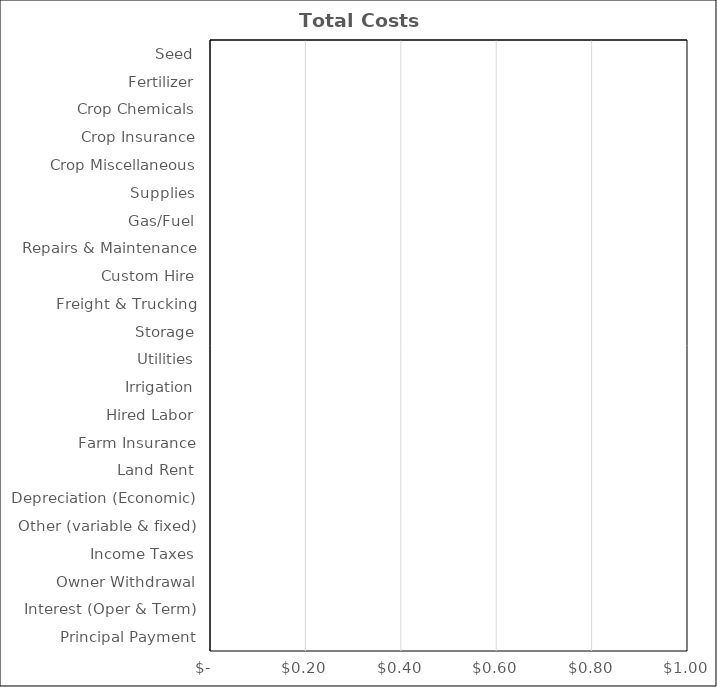
| Category | Alfalfa Hay Seeding |
|---|---|
| Seed | 0 |
| Fertilizer | 0 |
| Crop Chemicals | 0 |
| Crop Insurance | 0 |
| Crop Miscellaneous | 0 |
| Supplies | 0 |
| Gas/Fuel | 0 |
| Repairs & Maintenance | 0 |
| Custom Hire | 0 |
| Freight & Trucking | 0 |
| Storage | 0 |
| Utilities | 0 |
| Irrigation | 0 |
| Hired Labor | 0 |
| Farm Insurance | 0 |
| Land Rent | 0 |
| Depreciation (Economic) | 0 |
| Other (variable & fixed) | 0 |
| Income Taxes | 0 |
| Owner Withdrawal | 0 |
| Interest (Oper & Term) | 0 |
| Principal Payment | 0 |